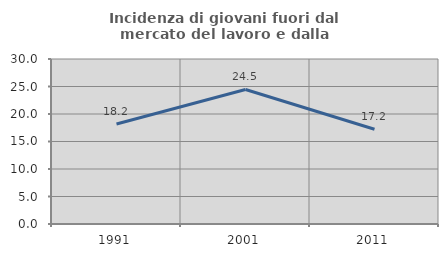
| Category | Incidenza di giovani fuori dal mercato del lavoro e dalla formazione  |
|---|---|
| 1991.0 | 18.182 |
| 2001.0 | 24.464 |
| 2011.0 | 17.222 |